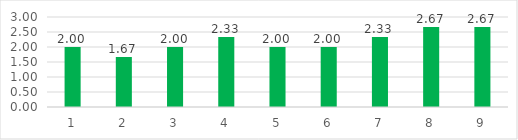
| Category | Series 0 |
|---|---|
| 0 | 2 |
| 1 | 1.667 |
| 2 | 2 |
| 3 | 2.333 |
| 4 | 2 |
| 5 | 2 |
| 6 | 2.333 |
| 7 | 2.667 |
| 8 | 2.667 |